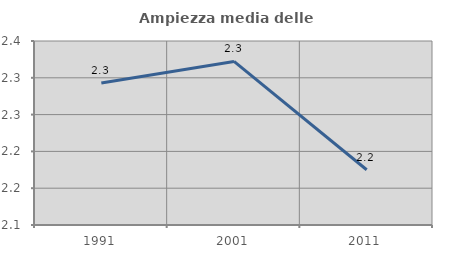
| Category | Ampiezza media delle famiglie |
|---|---|
| 1991.0 | 2.293 |
| 2001.0 | 2.322 |
| 2011.0 | 2.175 |